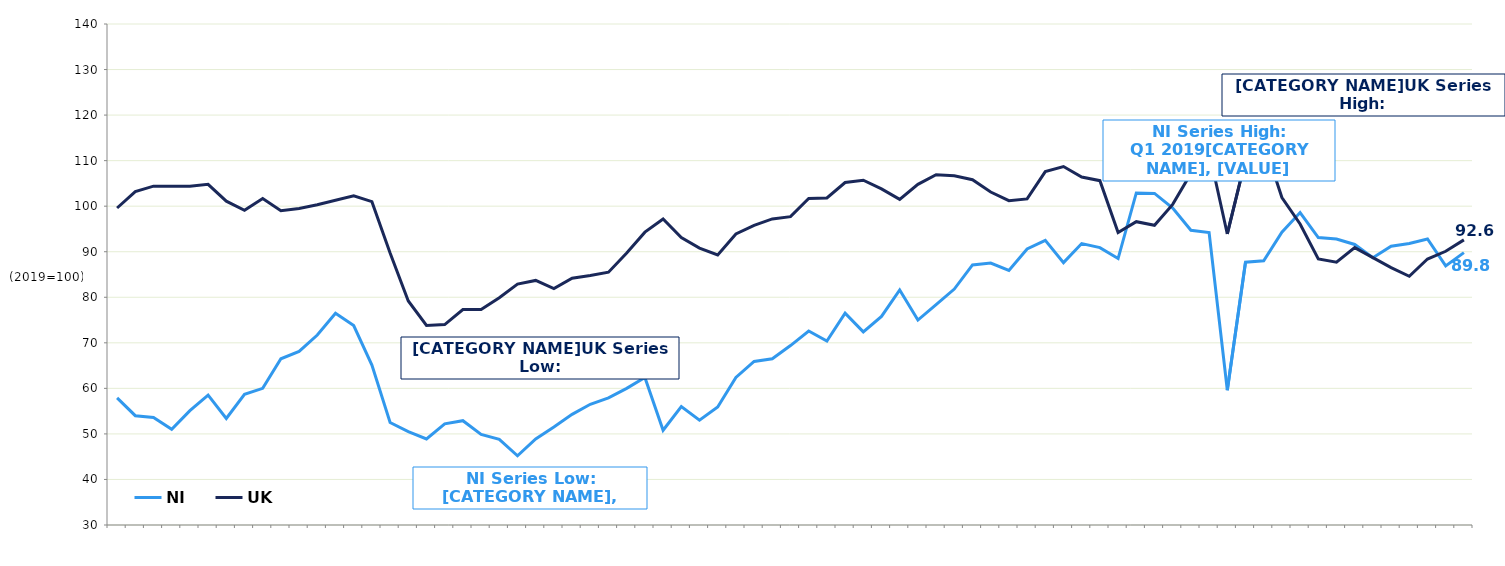
| Category | NI | UK  |
|---|---|---|
|  | 57.9 | 99.6 |
|  | 54 | 103.2 |
| Q3 2005 | 53.6 | 104.4 |
|  | 51 | 104.4 |
|  | 55.1 | 104.4 |
|  | 58.5 | 104.8 |
| Q3 2006 | 53.4 | 101.1 |
|  | 58.7 | 99.1 |
|  | 60 | 101.7 |
|  | 66.5 | 99 |
| Q3 2007 | 68.1 | 99.5 |
|  | 71.7 | 100.3 |
|  | 76.5 | 101.3 |
|  | 73.8 | 102.3 |
| Q3 2008 | 65.1 | 101 |
|  | 52.5 | 89.7 |
|  | 50.5 | 79.2 |
|  | 48.9 | 73.8 |
| Q3 2009 | 52.2 | 74 |
|  | 52.9 | 77.3 |
|  | 49.9 | 77.3 |
|  | 48.8 | 79.9 |
| Q3 2010 | 45.2 | 82.9 |
|  | 48.9 | 83.7 |
|  | 51.5 | 81.9 |
|  | 54.3 | 84.2 |
| Q3 2011 | 56.5 | 84.8 |
|  | 57.9 | 85.5 |
|  | 60 | 89.7 |
|  | 62.4 | 94.3 |
| Q3 2012 | 50.8 | 97.2 |
|  | 56 | 93.1 |
|  | 53 | 90.8 |
|  | 55.9 | 89.3 |
| Q3 2013 | 62.4 | 93.9 |
|  | 65.9 | 95.8 |
|  | 66.5 | 97.2 |
|  | 69.4 | 97.7 |
| Q3 2014 | 72.6 | 101.7 |
|  | 70.4 | 101.8 |
|  | 76.5 | 105.2 |
|  | 72.4 | 105.7 |
| Q3 2015 | 75.8 | 103.8 |
|  | 81.6 | 101.5 |
|  | 75 | 104.8 |
|  | 78.4 | 106.9 |
| Q3 2016 | 81.8 | 106.7 |
|  | 87.1 | 105.8 |
|  | 87.5 | 103.1 |
|  | 85.9 | 101.2 |
| Q3 2017 | 90.6 | 101.6 |
|  | 92.5 | 107.6 |
|  | 87.6 | 108.7 |
|  | 91.8 | 106.4 |
| Q3 2018 | 90.9 | 105.6 |
|  | 88.5 | 94.2 |
|  | 102.9 | 96.6 |
|  | 102.8 | 95.8 |
| Q3 2019 | 99.6 | 100.4 |
|  | 94.7 | 107.2 |
|  | 94.2 | 112 |
|  | 59.6 | 93.9 |
| Q3 2020 | 87.7 | 110.2 |
|  | 88 | 114.1 |
|  | 94.3 | 101.9 |
|  | 98.6 | 96.1 |
| Q3 2021 | 93.1 | 88.4 |
|  | 92.8 | 87.7 |
|  | 91.6 | 90.9 |
|  | 88.7 | 88.7 |
| Q3 2022 | 91.2 | 86.5 |
|  | 91.8 | 84.6 |
|  | 92.8 | 88.4 |
|  | 86.9 | 90.1 |
| Q3 2023 | 89.8 | 92.6 |